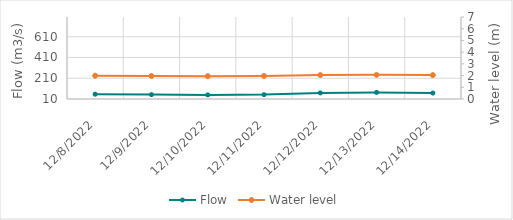
| Category | Flow |
|---|---|
| 4/26/22 | 674.08 |
| 4/25/22 | 724.92 |
| 4/24/22 | 758.58 |
| 4/23/22 | 781.98 |
| 4/22/22 | 785.46 |
| 4/21/22 | 560.3 |
| 4/20/22 | 503.89 |